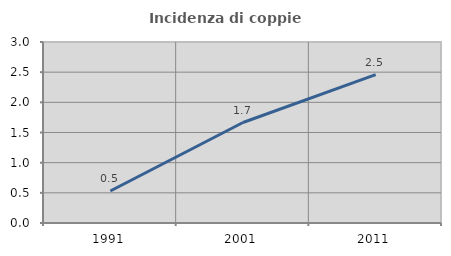
| Category | Incidenza di coppie miste |
|---|---|
| 1991.0 | 0.53 |
| 2001.0 | 1.666 |
| 2011.0 | 2.459 |